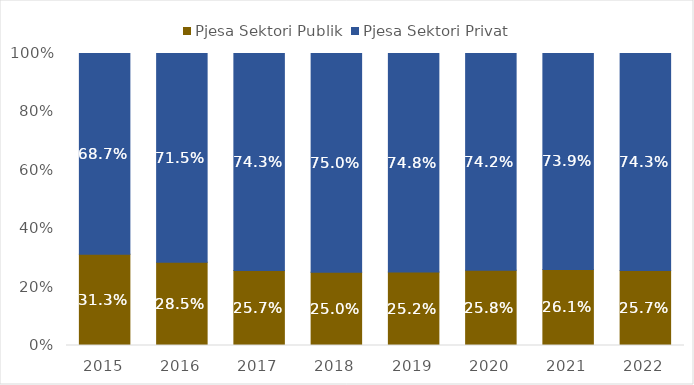
| Category | Pjesa Sektori Publik | Pjesa Sektori Privat |
|---|---|---|
| 2015.0 | 0.313 | 0.687 |
| 2016.0 | 0.285 | 0.715 |
| 2017.0 | 0.257 | 0.743 |
| 2018.0 | 0.25 | 0.75 |
| 2019.0 | 0.252 | 0.748 |
| 2020.0 | 0.258 | 0.742 |
| 2021.0 | 0.261 | 0.739 |
| 2022.0 | 0.257 | 0.743 |